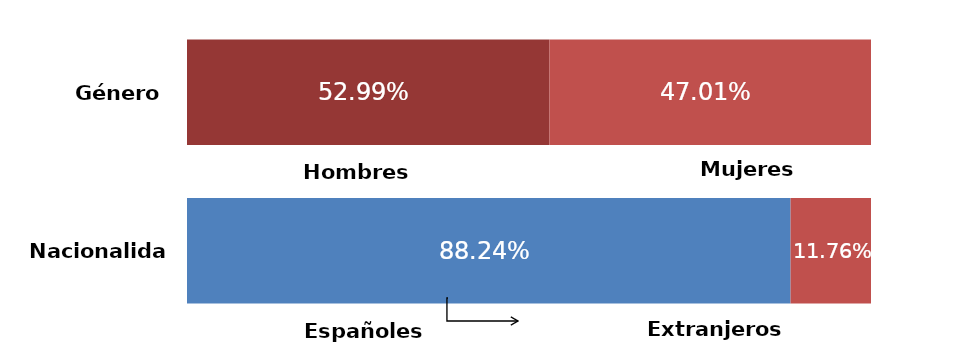
| Category | Series 0 | Series 1 |
|---|---|---|
| 0 | 0.53 | 0.47 |
| 1 | 0.882 | 0.118 |